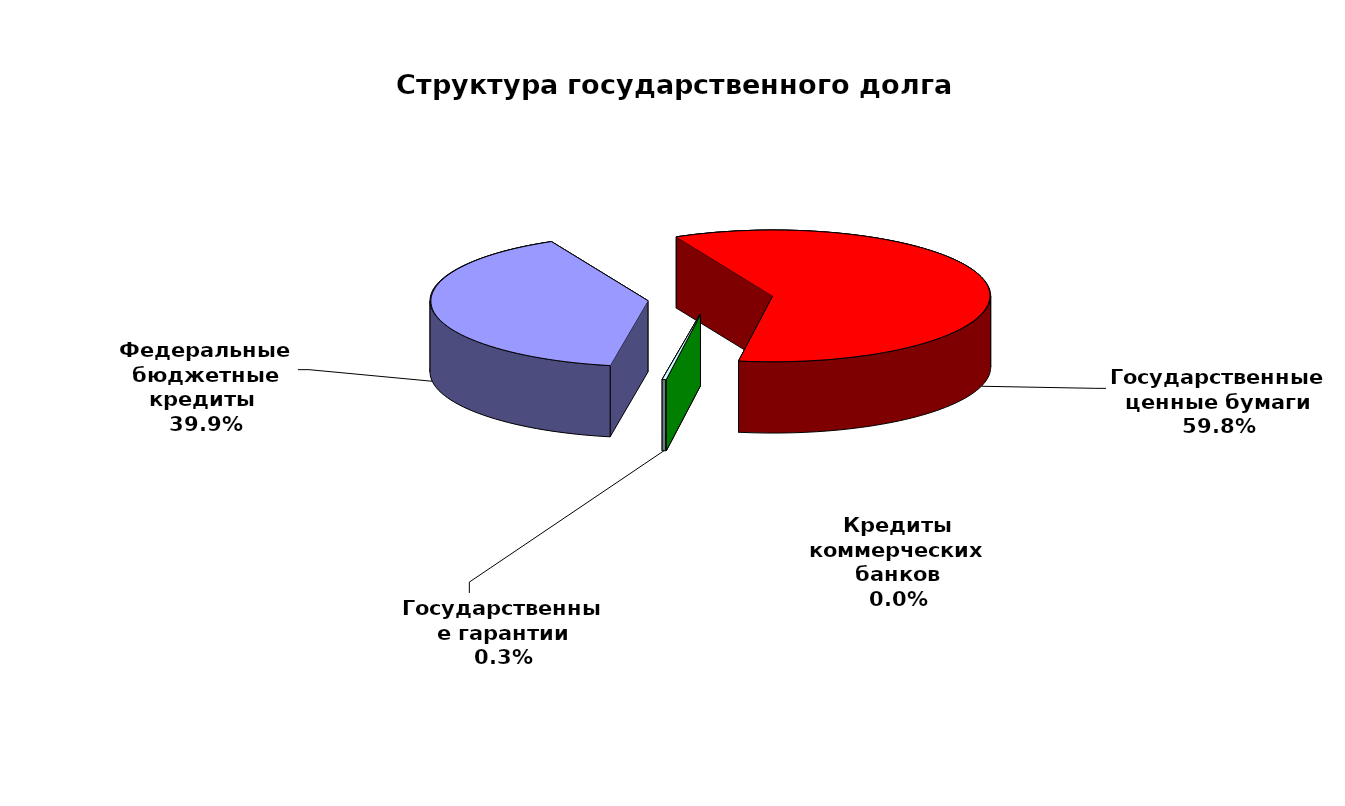
| Category | Series 0 |
|---|---|
| Федеральные бюджетные кредиты  | 27303300.463 |
| Государственные ценные бумаги | 40900000 |
| Кредиты коммерческих банков | 0 |
| Государственные гарантии | 184738.15 |